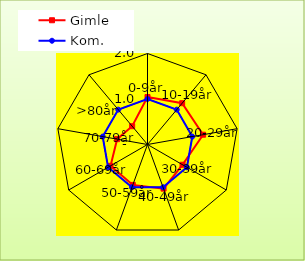
| Category | Gimle | Kom. |
|---|---|---|
| 0-9år | 1.043 | 1 |
| 10-19år | 1.184 | 1 |
| 20-29år | 1.241 | 1 |
| 30-39år | 0.889 | 1 |
| 40-49år | 1.032 | 1 |
| 50-59år | 0.945 | 1 |
| 60-69år | 0.938 | 1 |
| 70-79år | 0.678 | 1 |
| >80år | 0.525 | 1 |